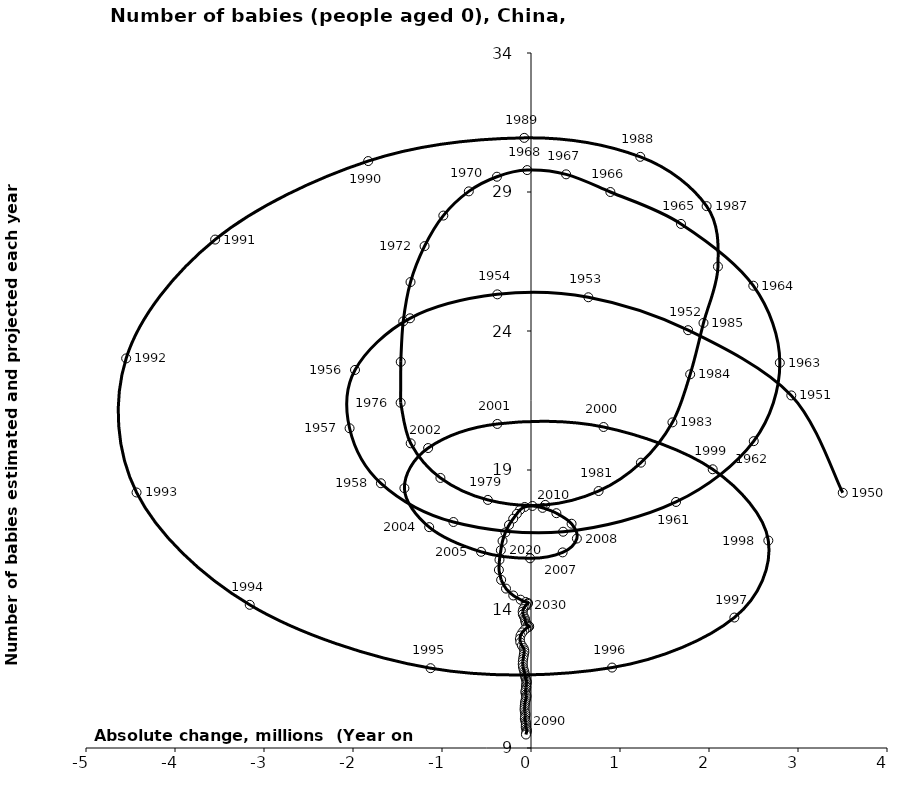
| Category | Series 0 |
|---|---|
| 3.5028090000000027 | 18.18 |
| 2.9246475000000007 | 21.683 |
| 1.7652249999999992 | 24.029 |
| 0.6445104999999991 | 25.213 |
| -0.3784015000000007 | 25.318 |
| -1.3595319999999997 | 24.456 |
| -1.9774184999999989 | 22.599 |
| -2.038425 | 20.502 |
| -1.6862375000000007 | 18.522 |
| -0.8715609999999998 | 17.129 |
| 0.36075699999999955 | 16.779 |
| 1.6292790000000004 | 17.851 |
| 2.5028935000000008 | 20.038 |
| 2.7958219999999994 | 22.856 |
| 2.4977494999999994 | 25.63 |
| 1.685238 | 27.852 |
| 0.8918545000000009 | 29 |
| 0.3943360000000009 | 29.636 |
| -0.043018500000000515 | 29.789 |
| -0.3829520000000013 | 29.55 |
| -0.6987964999999985 | 29.023 |
| -0.985104999999999 | 28.152 |
| -1.1958270000000013 | 27.053 |
| -1.3537510000000008 | 25.76 |
| -1.4355645 | 24.345 |
| -1.4635139999999982 | 22.889 |
| -1.464874 | 21.418 |
| -1.351805500000001 | 19.96 |
| -1.0177820000000004 | 18.714 |
| -0.4847160000000006 | 17.924 |
| 0.1598120000000005 | 17.745 |
| 0.7595645000000015 | 18.244 |
| 1.234902 | 19.264 |
| 1.5890214999999976 | 20.713 |
| 1.7884124999999997 | 22.442 |
| 1.938200000000002 | 24.29 |
| 2.1006360000000015 | 26.319 |
| 1.973153 | 28.491 |
| 1.2279079999999993 | 30.265 |
| -0.07601499999999994 | 30.947 |
| -1.829190500000001 | 30.113 |
| -3.549084500000001 | 27.289 |
| -4.548708499999998 | 23.015 |
| -4.432047999999999 | 18.191 |
| -3.160231500000001 | 14.151 |
| -1.1286490000000002 | 11.871 |
| 0.9109189999999998 | 11.893 |
| 2.2850645000000007 | 13.693 |
| 2.6666134999999995 | 16.463 |
| 2.0415414999999992 | 19.026 |
| 0.8152465000000007 | 20.546 |
| -0.37841150000000034 | 20.657 |
| -1.1557934999999997 | 19.79 |
| -1.422345 | 18.345 |
| -1.1441180000000006 | 16.945 |
| -0.5608239999999993 | 16.057 |
| -0.010350499999999485 | 15.823 |
| 0.35561699999999963 | 16.036 |
| 0.5155274999999993 | 16.535 |
| 0.4560075000000001 | 17.067 |
| 0.28528149999999997 | 17.447 |
| 0.13002949999999913 | 17.638 |
| 0.016081500000000304 | 17.707 |
| -0.07077849999999941 | 17.67 |
| -0.12395599999999973 | 17.565 |
| -0.1591194999999992 | 17.422 |
| -0.199997999999999 | 17.247 |
| -0.2470155000000016 | 17.022 |
| -0.2875330000000016 | 16.753 |
| -0.3197494999999986 | 16.447 |
| -0.33877199999999963 | 16.113 |
| -0.35421300000000056 | 15.769 |
| -0.36062550000000027 | 15.405 |
| -0.3354815000000002 | 15.048 |
| -0.28105849999999943 | 14.734 |
| -0.1994340000000001 | 14.486 |
| -0.11663800000000002 | 14.335 |
| -0.05989299999999975 | 14.253 |
| -0.03307850000000112 | 14.215 |
| -0.037988999999999606 | 14.187 |
| -0.054607499999999476 | 14.139 |
| -0.07098250000000039 | 14.077 |
| -0.08632949999999973 | 13.997 |
| -0.09371799999999908 | 13.905 |
| -0.09186950000000049 | 13.81 |
| -0.07891700000000057 | 13.721 |
| -0.06789749999999994 | 13.652 |
| -0.06515999999999966 | 13.585 |
| -0.060524500000000536 | 13.522 |
| -0.05428250000000023 | 13.464 |
| -0.038559999999999484 | 13.413 |
| -0.022602500000000525 | 13.387 |
| -0.020556499999999645 | 13.368 |
| -0.030491500000000116 | 13.346 |
| -0.05197900000000022 | 13.307 |
| -0.07479899999999962 | 13.242 |
| -0.09717149999999997 | 13.157 |
| -0.11725599999999936 | 13.048 |
| -0.12487199999999987 | 12.923 |
| -0.12025800000000064 | 12.798 |
| -0.10225250000000052 | 12.682 |
| -0.08346199999999993 | 12.593 |
| -0.0752815 | 12.515 |
| -0.0742105000000004 | 12.443 |
| -0.07999849999999942 | 12.367 |
| -0.08441399999999977 | 12.283 |
| -0.08753750000000071 | 12.198 |
| -0.0919705000000004 | 12.108 |
| -0.09288949999999918 | 12.014 |
| -0.09054450000000003 | 11.922 |
| -0.08371499999999976 | 11.833 |
| -0.07602849999999872 | 11.754 |
| -0.07093300000000013 | 11.681 |
| -0.06672900000000048 | 11.613 |
| -0.06420199999999987 | 11.548 |
| -0.05849849999999979 | 11.484 |
| -0.051390500000001005 | 11.431 |
| -0.048669000000001184 | 11.381 |
| -0.04955449999999928 | 11.333 |
| -0.05400899999999975 | 11.282 |
| -0.05402500000000021 | 11.225 |
| -0.053145999999999916 | 11.174 |
| -0.057519499999999724 | 11.119 |
| -0.061248499999999595 | 11.059 |
| -0.06326650000000011 | 10.996 |
| -0.0571754999999996 | 10.933 |
| -0.05070150000000062 | 10.882 |
| -0.05203950000000024 | 10.831 |
| -0.055599999999999206 | 10.778 |
| -0.061257499999999965 | 10.72 |
| -0.06512150000000005 | 10.656 |
| -0.06769149999999957 | 10.59 |
| -0.07022000000000084 | 10.52 |
| -0.07090400000000052 | 10.449 |
| -0.0724285 | 10.378 |
| -0.06923449999999942 | 10.305 |
| -0.06335099999999905 | 10.24 |
| -0.06307800000000086 | 10.178 |
| -0.06607750000000046 | 10.114 |
| -0.06933899999999937 | 10.046 |
| -0.06374799999999947 | 9.975 |
| -0.057476000000000305 | 9.918 |
| -0.0581485000000006 | 9.86 |
| -0.05827749999999998 | 9.802 |
| -0.05900349999999932 | 9.744 |
| -0.05300750000000054 | 9.684 |
| -0.04692350000000012 | 9.638 |
| -0.04904999999999937 | 9.59 |
| -0.052641999999999634 | 9.539 |
| -0.05686599999999942 | 9.485 |